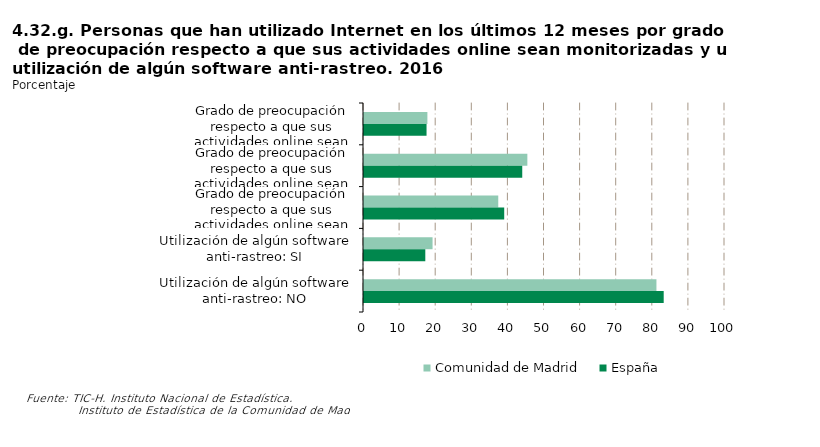
| Category | Comunidad de Madrid | España |
|---|---|---|
| Grado de preocupación respecto a que sus actividades online sean monitorizadas: muy preocupado | 17.56 | 17.325 |
| Grado de preocupación respecto a que sus actividades online sean monitorizadas: algo preocupado | 45.251 | 43.835 |
| Grado de preocupación respecto a que sus actividades online sean monitorizadas: nada preocupado | 37.189 | 38.84 |
| Utilización de algún software anti-rastreo: SI | 18.991 | 16.981 |
| Utilización de algún software anti-rastreo: NO | 81.009 | 83.019 |